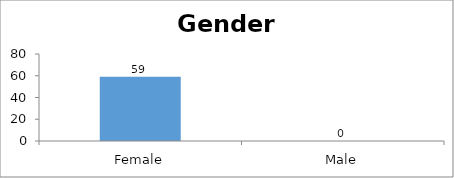
| Category | Gender |
|---|---|
| Female | 59 |
| Male | 0 |